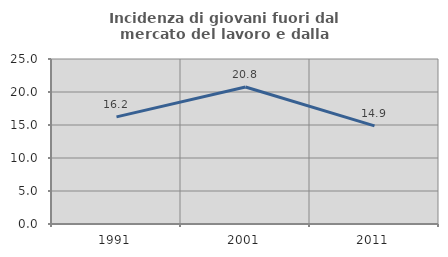
| Category | Incidenza di giovani fuori dal mercato del lavoro e dalla formazione  |
|---|---|
| 1991.0 | 16.23 |
| 2001.0 | 20.752 |
| 2011.0 | 14.865 |